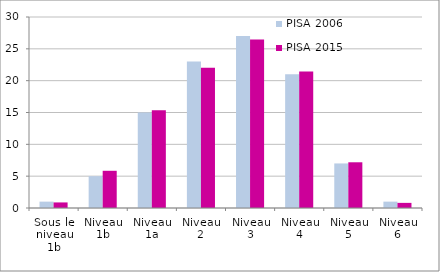
| Category | PISA 2006 | PISA 2015 |
|---|---|---|
| Sous le niveau 1b | 1 | 0.875 |
| Niveau 1b | 5 | 5.844 |
| Niveau 1a | 15 | 15.341 |
| Niveau 2 | 23 | 22.03 |
| Niveau 3
 | 27 | 26.476 |
| Niveau 4
 | 21 | 21.447 |
| Niveau 5
 | 7 | 7.181 |
| Niveau 6
 | 1 | 0.805 |